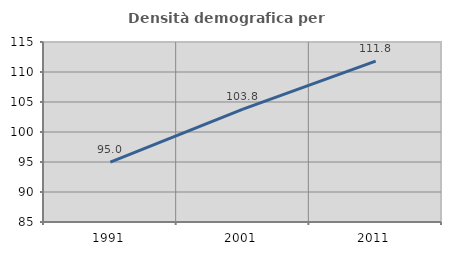
| Category | Densità demografica |
|---|---|
| 1991.0 | 94.982 |
| 2001.0 | 103.799 |
| 2011.0 | 111.815 |